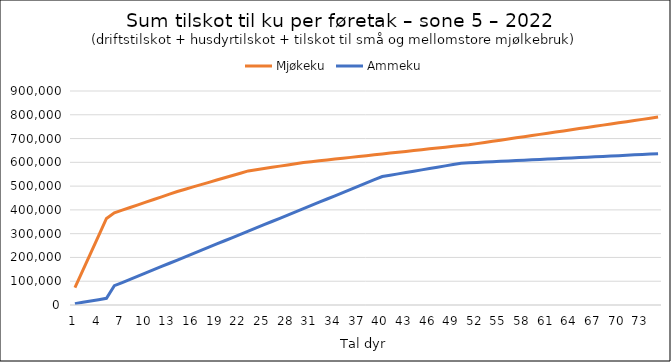
| Category | Mjøkeku | Ammeku |
|---|---|---|
| 0 | 72793 | 5596 |
| 1 | 145586 | 11192 |
| 2 | 218379 | 16788 |
| 3 | 291172 | 22384 |
| 4 | 363965 | 27980 |
| 5 | 387638 | 81048 |
| 6 | 398861 | 94556 |
| 7 | 410084 | 108064 |
| 8 | 421307 | 121572 |
| 9 | 432530 | 135080 |
| 10 | 443753 | 148588 |
| 11 | 454976 | 162096 |
| 12 | 466199 | 175604 |
| 13 | 477422 | 189112 |
| 14 | 487023 | 202620 |
| 15 | 496624 | 216128 |
| 16 | 506225 | 229636 |
| 17 | 515826 | 243144 |
| 18 | 525427 | 256652 |
| 19 | 535028 | 270160 |
| 20 | 544629 | 283668 |
| 21 | 554230 | 297176 |
| 22 | 563831 | 310684 |
| 23 | 568897 | 324192 |
| 24 | 573963 | 337700 |
| 25 | 579029 | 351208 |
| 26 | 584095 | 364716 |
| 27 | 589161 | 378224 |
| 28 | 594227 | 391732 |
| 29 | 599293 | 405240 |
| 30 | 602882 | 418748 |
| 31 | 606471 | 432256 |
| 32 | 610060 | 445764 |
| 33 | 613649 | 459272 |
| 34 | 617238 | 472780 |
| 35 | 620827 | 486288 |
| 36 | 624416 | 499796 |
| 37 | 628005 | 513304 |
| 38 | 631594 | 526812 |
| 39 | 635183 | 540320 |
| 40 | 638772 | 545916 |
| 41 | 642361 | 551512 |
| 42 | 645950 | 557108 |
| 43 | 649539 | 562704 |
| 44 | 653128 | 568300 |
| 45 | 656717 | 573896 |
| 46 | 660306 | 579492 |
| 47 | 663895 | 585088 |
| 48 | 667484 | 590684 |
| 49 | 671073 | 596280 |
| 50 | 673875 | 597876 |
| 51 | 678732 | 599472 |
| 52 | 683589 | 601068 |
| 53 | 688446 | 602664 |
| 54 | 693303 | 604260 |
| 55 | 698160 | 605856 |
| 56 | 703017 | 607452 |
| 57 | 707874 | 609048 |
| 58 | 712731 | 610644 |
| 59 | 717588 | 612240 |
| 60 | 722445 | 613836 |
| 61 | 727302 | 615432 |
| 62 | 732159 | 617028 |
| 63 | 737016 | 618624 |
| 64 | 741873 | 620220 |
| 65 | 746730 | 621816 |
| 66 | 751587 | 623412 |
| 67 | 756444 | 625008 |
| 68 | 761301 | 626604 |
| 69 | 766158 | 628200 |
| 70 | 771015 | 629796 |
| 71 | 775872 | 631392 |
| 72 | 780729 | 632988 |
| 73 | 785586 | 634584 |
| 74 | 790443 | 636180 |